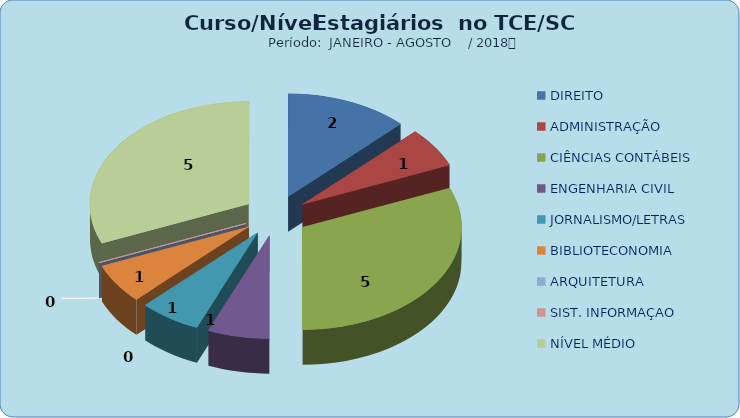
| Category | Series 0 |
|---|---|
| DIREITO | 2 |
| ADMINISTRAÇÃO | 1 |
| CIÊNCIAS CONTÁBEIS | 5 |
| ENGENHARIA CIVIL | 1 |
| JORNALISMO/LETRAS | 1 |
| BIBLIOTECONOMIA | 1 |
| ARQUITETURA | 0 |
| SIST. INFORMAÇAO | 0 |
| NÍVEL MÉDIO | 5 |